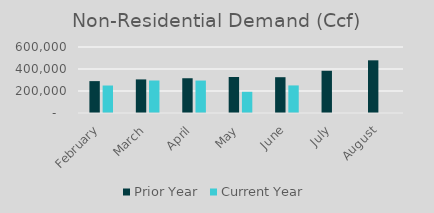
| Category | Prior Year | Current Year |
|---|---|---|
| February | 289857 | 249807 |
| March | 305426 | 295423 |
| April | 315985 | 295012.49 |
| May | 327135 | 192797 |
| June | 325420 | 250692.26 |
| July | 383814 | 0 |
| August | 478930 | 0 |